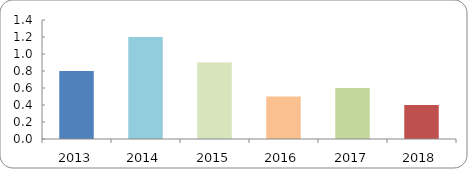
| Category | COBERTURA DE BECADOS EXTERNOS (%) |
|---|---|
| 2013.0 | 0.8 |
| 2014.0 | 1.2 |
| 2015.0 | 0.9 |
| 2016.0 | 0.5 |
| 2017.0 | 0.6 |
| 2018.0 | 0.4 |